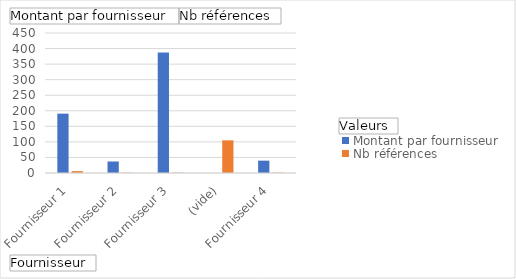
| Category | Montant par fournisseur | Nb références |
|---|---|---|
| Fournisseur 1 | 190.82 | 6 |
| Fournisseur 2 | 37 | 1 |
| Fournisseur 3 | 387 | 1 |
| (vide) | 0 | 105 |
| Fournisseur 4 | 39.675 | 1 |